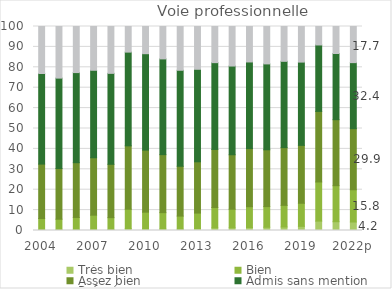
| Category | Très bien | Bien | Assez bien | Admis sans mention | Refusé |
|---|---|---|---|---|---|
| 2004 | 0.384 | 5.482 | 26.683 | 44.416 | 23.035 |
| 2005 | 0.363 | 5.18 | 24.837 | 44.321 | 25.299 |
| 2006 | 0.483 | 5.907 | 26.846 | 44.176 | 22.588 |
| 2007 | 0.564 | 6.953 | 28.145 | 42.885 | 21.453 |
| 2008 | 0.461 | 5.84 | 26.153 | 44.58 | 22.966 |
| 2009 | 0.902 | 9.539 | 31.054 | 45.95 | 12.555 |
| 2010 | 0.742 | 8.237 | 30.431 | 47.256 | 13.334 |
| 2011 | 0.742 | 8.003 | 28.438 | 46.933 | 15.885 |
| 2012 | 0.633 | 6.43 | 24.421 | 47.059 | 21.457 |
| 2013 | 0.94 | 7.603 | 25.131 | 45.355 | 20.971 |
| 2014 | 1.289 | 9.977 | 28.462 | 42.552 | 17.721 |
| 2015 | 1.326 | 9.103 | 26.702 | 43.486 | 19.383 |
| 2016 | 1.447 | 10.217 | 28.509 | 42.443 | 17.384 |
| 2017 | 1.597 | 10.12 | 27.848 | 42.097 | 18.338 |
| 2018 | 1.728 | 10.596 | 28.31 | 42.294 | 17.072 |
| 2019 | 2.037 | 11.318 | 28.376 | 40.82 | 17.449 |
| 2020 | 4.6 | 19.185 | 34.591 | 32.571 | 9.053 |
| 2021 | 4.31 | 17.656 | 32.349 | 32.446 | 13.24 |
| 2022p | 4.159 | 15.81 | 29.944 | 32.374 | 17.712 |